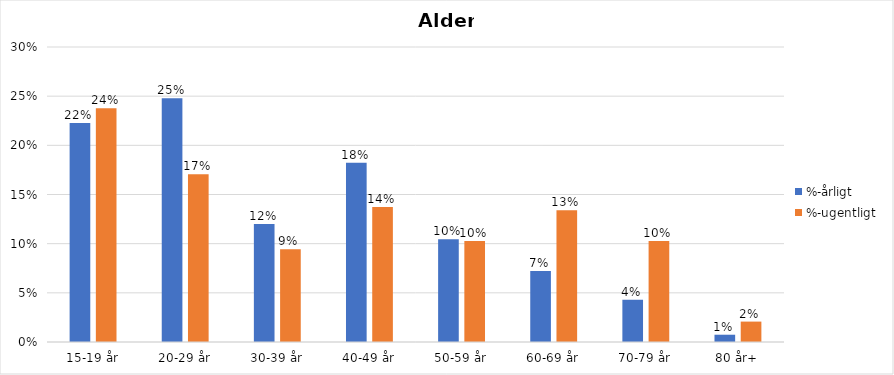
| Category | %-årligt | %-ugentligt |
|---|---|---|
| 15-19 år | 0.223 | 0.238 |
| 20-29 år | 0.248 | 0.17 |
| 30-39 år | 0.12 | 0.094 |
| 40-49 år | 0.182 | 0.137 |
| 50-59 år | 0.104 | 0.103 |
| 60-69 år | 0.072 | 0.134 |
| 70-79 år | 0.043 | 0.103 |
| 80 år+ | 0.007 | 0.021 |